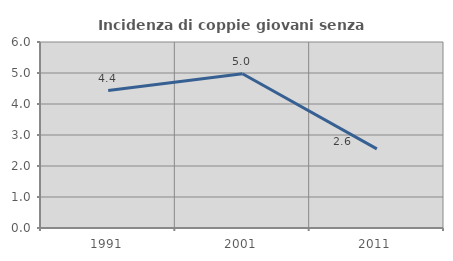
| Category | Incidenza di coppie giovani senza figli |
|---|---|
| 1991.0 | 4.433 |
| 2001.0 | 4.978 |
| 2011.0 | 2.553 |